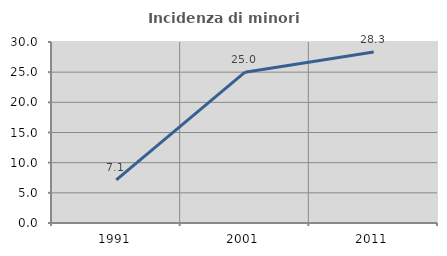
| Category | Incidenza di minori stranieri |
|---|---|
| 1991.0 | 7.143 |
| 2001.0 | 25 |
| 2011.0 | 28.326 |